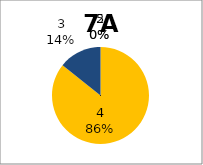
| Category | Series 0 |
|---|---|
| 5.0 | 0 |
| 4.0 | 6 |
| 3.0 | 1 |
| 2.0 | 0 |